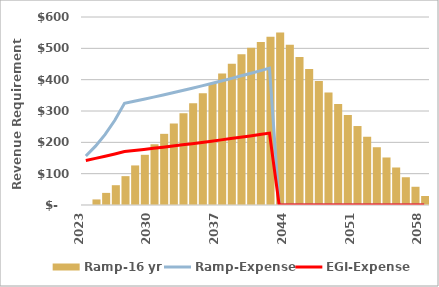
| Category | Ramp-16 yr |
|---|---|
| 2023.0 | 0 |
| 2024.0 | 17.795 |
| 2025.0 | 38.648 |
| 2026.0 | 63.171 |
| 2027.0 | 92.097 |
| 2028.0 | 126.308 |
| 2029.0 | 160.218 |
| 2030.0 | 193.821 |
| 2031.0 | 227.112 |
| 2032.0 | 260.083 |
| 2033.0 | 292.729 |
| 2034.0 | 325.043 |
| 2035.0 | 357.018 |
| 2036.0 | 388.648 |
| 2037.0 | 419.926 |
| 2038.0 | 450.844 |
| 2039.0 | 481.395 |
| 2040.0 | 501.793 |
| 2041.0 | 520.354 |
| 2042.0 | 536.779 |
| 2043.0 | 550.713 |
| 2044.0 | 511.072 |
| 2045.0 | 472.064 |
| 2046.0 | 433.702 |
| 2047.0 | 395.998 |
| 2048.0 | 358.966 |
| 2049.0 | 322.62 |
| 2050.0 | 286.972 |
| 2051.0 | 252.038 |
| 2052.0 | 217.83 |
| 2053.0 | 184.365 |
| 2054.0 | 151.656 |
| 2055.0 | 119.719 |
| 2056.0 | 88.568 |
| 2057.0 | 58.221 |
| 2058.0 | 28.693 |